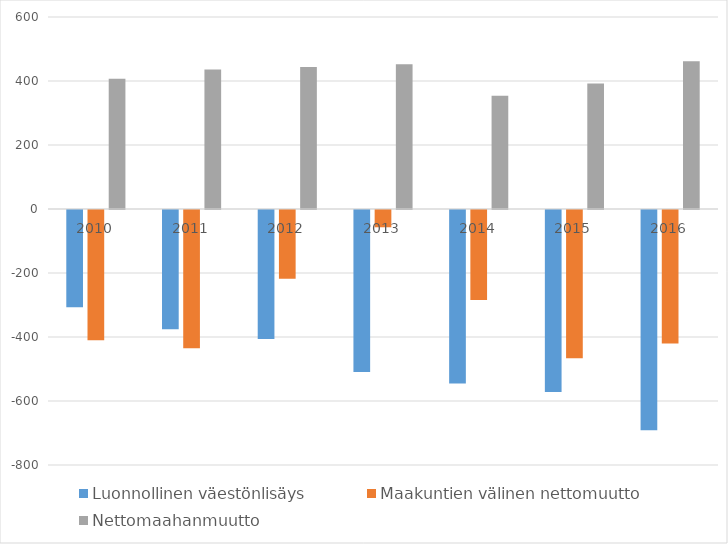
| Category | Luonnollinen väestönlisäys | Maakuntien välinen nettomuutto | Nettomaahanmuutto |
|---|---|---|---|
| 2010 | -304 | -407 | 407 |
| 2011 | -373 | -432 | 436 |
| 2012 | -403 | -215 | 444 |
| 2013 | -506 | -54 | 452 |
| 2014 | -542 | -281 | 354 |
| 2015 | -569 | -463 | 392 |
| 2016 | -688 | -417 | 462 |